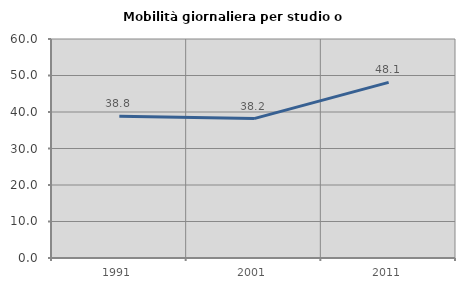
| Category | Mobilità giornaliera per studio o lavoro |
|---|---|
| 1991.0 | 38.814 |
| 2001.0 | 38.188 |
| 2011.0 | 48.12 |